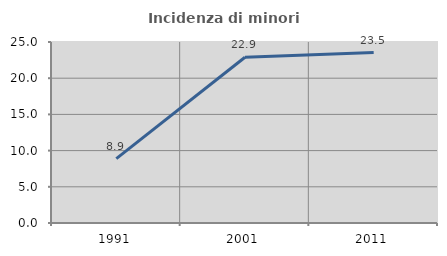
| Category | Incidenza di minori stranieri |
|---|---|
| 1991.0 | 8.889 |
| 2001.0 | 22.892 |
| 2011.0 | 23.54 |